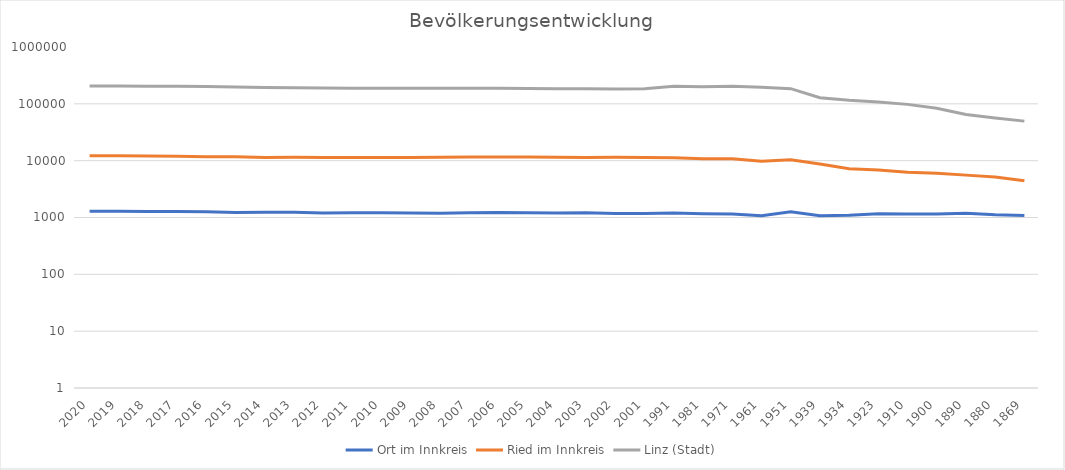
| Category | Ort im Innkreis | Ried im Innkreis | Linz (Stadt) |
|---|---|---|---|
| 2020.0 | 1286 | 12220 | 206595 |
| 2019.0 | 1286 | 12220 | 205726 |
| 2018.0 | 1269 | 12055 | 204846 |
| 2017.0 | 1275 | 11903 | 203012 |
| 2016.0 | 1256 | 11775 | 200839 |
| 2015.0 | 1219 | 11672 | 197427 |
| 2014.0 | 1232 | 11416 | 193814 |
| 2013.0 | 1232 | 11444 | 191501 |
| 2012.0 | 1202 | 11381 | 190053 |
| 2011.0 | 1213 | 11368 | 188431 |
| 2010.0 | 1216 | 11405 | 188549 |
| 2009.0 | 1196 | 11401 | 188520 |
| 2008.0 | 1188 | 11536 | 188277 |
| 2007.0 | 1207 | 11590 | 188277 |
| 2006.0 | 1230 | 11575 | 187936 |
| 2005.0 | 1210 | 11570 | 186781 |
| 2004.0 | 1198 | 11489 | 185172 |
| 2003.0 | 1207 | 11409 | 183827 |
| 2002.0 | 1172 | 11432 | 182304 |
| 2001.0 | 1181 | 11404 | 183504 |
| 1991.0 | 1202 | 11260 | 203044 |
| 1981.0 | 1169 | 10855 | 199910 |
| 1971.0 | 1149 | 10758 | 204889 |
| 1961.0 | 1076 | 9741 | 195978 |
| 1951.0 | 1264 | 10363 | 184685 |
| 1939.0 | 1071 | 8730 | 128177 |
| 1934.0 | 1097 | 7204 | 115338 |
| 1923.0 | 1165 | 6869 | 107463 |
| 1910.0 | 1155 | 6245 | 97852 |
| 1900.0 | 1157 | 5997 | 83356 |
| 1890.0 | 1187 | 5567 | 65090 |
| 1880.0 | 1113 | 5155 | 56569 |
| 1869.0 | 1080 | 4428 | 49635 |